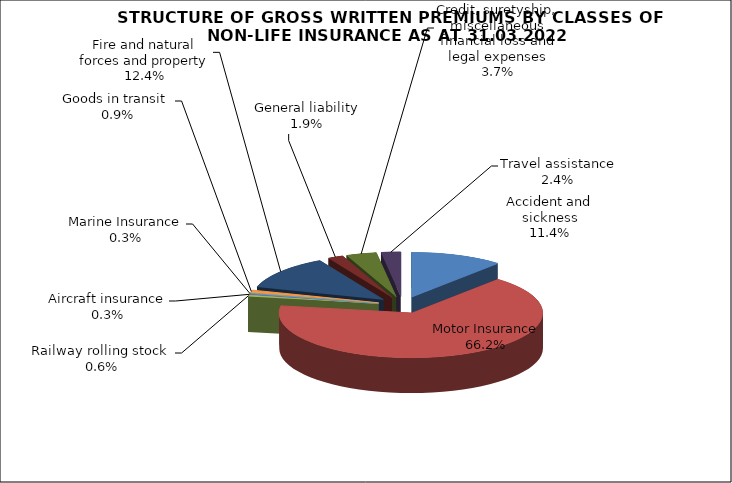
| Category | Accident and sickness |
|---|---|
| Accident and sickness | 0.114 |
| Motor Insurance | 0.662 |
| Railway rolling stock  | 0.006 |
| Aircraft insurance | 0.003 |
| Marine Insurance | 0.003 |
| Goods in transit  | 0.009 |
| Fire and natural forces and property | 0.124 |
| General liability | 0.019 |
| Credit, suretyship, miscellaneous financial loss and legal expenses | 0.037 |
| Travel assistance | 0.024 |